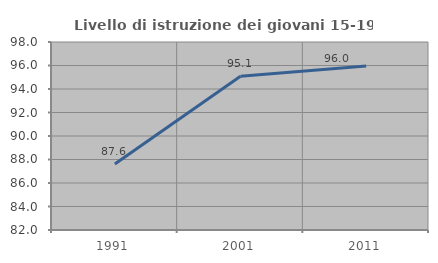
| Category | Livello di istruzione dei giovani 15-19 anni |
|---|---|
| 1991.0 | 87.623 |
| 2001.0 | 95.077 |
| 2011.0 | 95.965 |